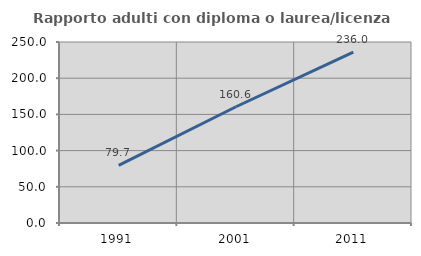
| Category | Rapporto adulti con diploma o laurea/licenza media  |
|---|---|
| 1991.0 | 79.667 |
| 2001.0 | 160.585 |
| 2011.0 | 235.979 |